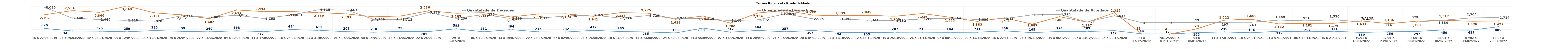
| Category | Quantidade de Decisões | Quantidade de Despachos |
|---|---|---|
| 16 a 22/03/2019 | 620 | 2102 |
| 23 a 29/03/2020 | 345 | 2554 |
| 30 a 05/04/2020 | 325 | 2366 |
| 06 a 12/04/2020 | 259 | 3048 |
| 13 a 19/04/2020 | 385 | 2311 |
| 20 a 26/04/2020 | 309 | 2092 |
| 27 a 03/05/2020 | 249 | 1682 |
| 04 a 10/05/2020 | 368 | 2624 |
| 11 a 17/05/2020 | 277 | 2443 |
| 18 a 24/05/2020 | 494 | 2445 |
| 25 a 31/05/2020 | 411 | 2339 |
| 01 a 07/06/2020 | 268 | 2193 |
| 08 a 14/06/2020 | 210 | 1884 |
| 15 a 21/06/2020 | 298 | 1971 |
| 22 a 28/06/2020 | 281 | 2536 |
| 29  A 05/07/2020 | 583 | 2265 |
| 06 a 12/07/2020 | 251 | 2331 |
| 13 a 19/07/2020 | 494 | 1867 |
| 20 a 26/07/2020 | 246 | 2190 |
| 27 a 02/08/2020 | 232 | 2198 |
| 03 a 09/08/2020 | 412 | 1941 |
| 10 a 16/08/2020 | 285 | 2338 |
| 17 a 23/08/2020 | 235 | 2275 |
| 24 a 30/08/2020 | 133 | 1613 |
| 31 a 06/09/2020 | 653 | 1964 |
| 07 a 13/09/2020 | 217 | 1200 |
| 14 a 20/09/2020 | 404 | 2289 |
| 21 a 27/09/2020 | 257 | 2574 |
| 28 a 04/10/2020 | 395 | 2069 |
| 05 a 11/10/2020 | 194 | 1989 |
| 12 a 18/10/2020 | 155 | 2045 |
| 19 a 25/10/2020 | 207 | 1940 |
| 26 a 01/11/2020 | 215 | 2236 |
| 02 a 08/11/2020 | 194 | 1833 |
| 09 a 15/11/2020 | 211 | 1383 |
| 16 a 22/11/2020 | 356 | 1764 |
| 23 a 29/11/2020 | 165 | 1087 |
| 30 a 06/12/20 | 291 | 1889 |
| 07 a 13/12/2020 | 282 | 1297 |
| 14 a 20/12/2020 | 377 | 2315 |
| 21 a 27/12/2020* | 33 | 13 |
| 28/12/2020 a 03/01/2021* | 17 | 4 |
| 04 a 10/01/2021* | 169 | 570 |
| 11 a 17/01/2021 | 240 | 1522 |
| 18 a 24/01/2021 | 148 | 1609 |
| 01 a 07/11/2021 | 319 | 1112 |
| 08 a 14/11/2021 | 257 | 1181 |
| 15 a 21/11/2021 | 311 | 1176 |
| 10/01 a 16/01/2022 | 189 | 1433 |
| 17/01 a 23/01/2022 | 256 | 1136 |
| 24/01 a 30/01/2022 | 292 | 1398 |
| 31/01 a 06/02/2022 | 459 | 1512 |
| 07/02 a 13/02/2022 | 427 | 1396 |
| 14/02 a 20/02/2022 | 805 | 1427 |